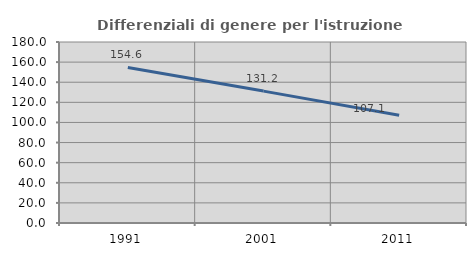
| Category | Differenziali di genere per l'istruzione superiore |
|---|---|
| 1991.0 | 154.649 |
| 2001.0 | 131.169 |
| 2011.0 | 107.14 |